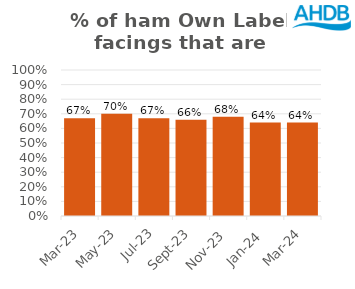
| Category | Ham |
|---|---|
| 2023-03-01 | 0.67 |
| 2023-05-01 | 0.7 |
| 2023-07-01 | 0.67 |
| 2023-09-01 | 0.66 |
| 2023-11-01 | 0.68 |
| 2024-01-01 | 0.64 |
| 2024-03-01 | 0.64 |